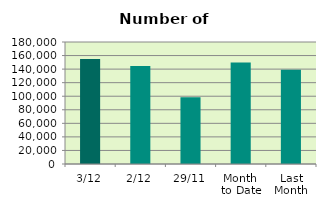
| Category | Series 0 |
|---|---|
| 3/12 | 154966 |
| 2/12 | 144696 |
| 29/11 | 98338 |
| Month 
to Date | 149831 |
| Last
Month | 138953.619 |